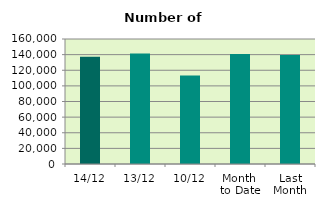
| Category | Series 0 |
|---|---|
| 14/12 | 137166 |
| 13/12 | 141498 |
| 10/12 | 113244 |
| Month 
to Date | 140672.8 |
| Last
Month | 139642.182 |